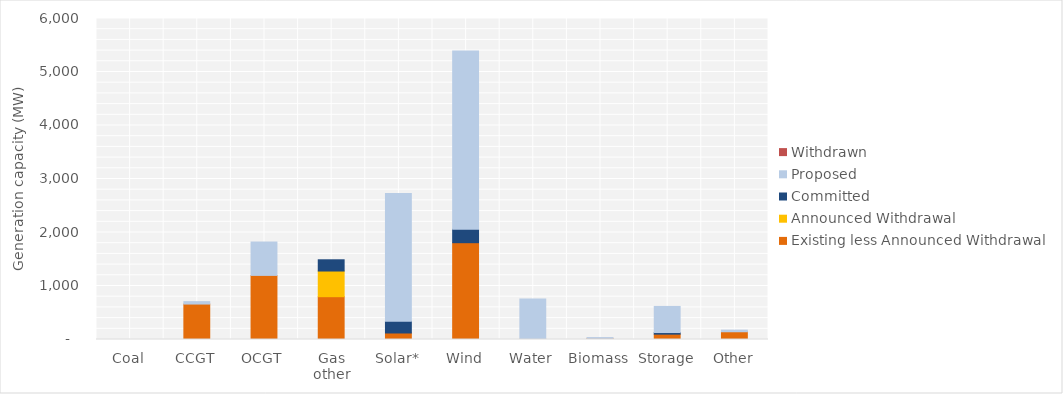
| Category | Existing less Announced Withdrawal | Announced Withdrawal | Committed | Proposed | Withdrawn |
|---|---|---|---|---|---|
| Coal | 0 | 0 | 0 | 0 | 0 |
| CCGT | 662.5 | 0 | 0 | 45 | 0 |
| OCGT | 1198.04 | 0 | 0 | 624 | 0 |
| Gas other | 800 | 480 | 210 | 0 | 0 |
| Solar* | 121.618 | 0 | 218 | 2387.5 | 0 |
| Wind | 1809.45 | 0 | 251 | 3329.8 | 0 |
| Water | 3.85 | 0 | 0 | 755 | 0 |
| Biomass | 20.473 | 0 | 0 | 15 | 0 |
| Storage | 100 | 0 | 30 | 488 | 0 |
| Other | 144.698 | 0 | 0 | 30 | 0 |